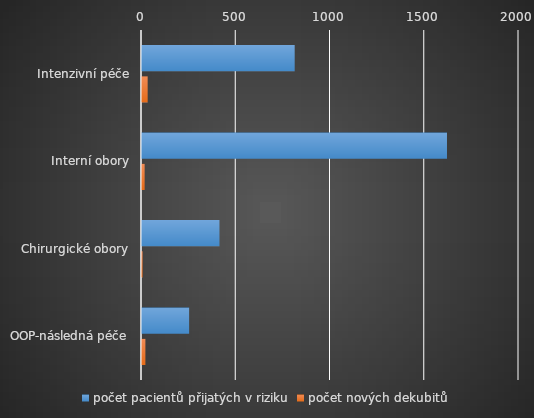
| Category | počet pacientů přijatých v riziku | počet nových dekubitů |
|---|---|---|
| Intenzivní péče | 810 | 30 |
| Interní obory | 1618 | 14 |
| Chirurgické obory | 411 | 3 |
| OOP-následná péče | 250 | 18 |